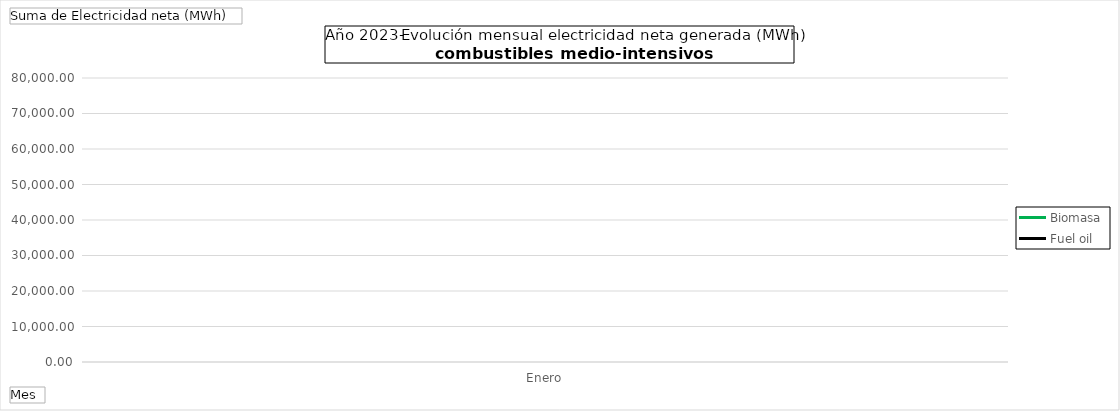
| Category | Biomasa | Fuel oil |
|---|---|---|
| Enero | 56326.81 | 72552.17 |